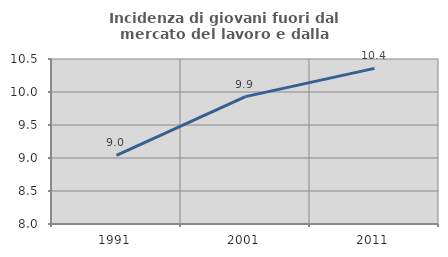
| Category | Incidenza di giovani fuori dal mercato del lavoro e dalla formazione  |
|---|---|
| 1991.0 | 9.039 |
| 2001.0 | 9.93 |
| 2011.0 | 10.358 |